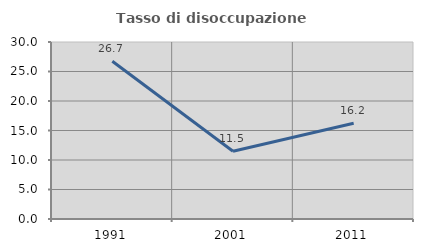
| Category | Tasso di disoccupazione giovanile  |
|---|---|
| 1991.0 | 26.733 |
| 2001.0 | 11.475 |
| 2011.0 | 16.216 |